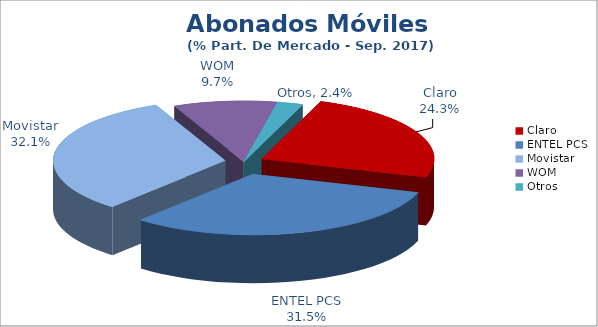
| Category | Series 0 |
|---|---|
| Claro | 0.243 |
| ENTEL PCS | 0.315 |
| Movistar | 0.321 |
| WOM | 0.097 |
| Otros | 0.024 |